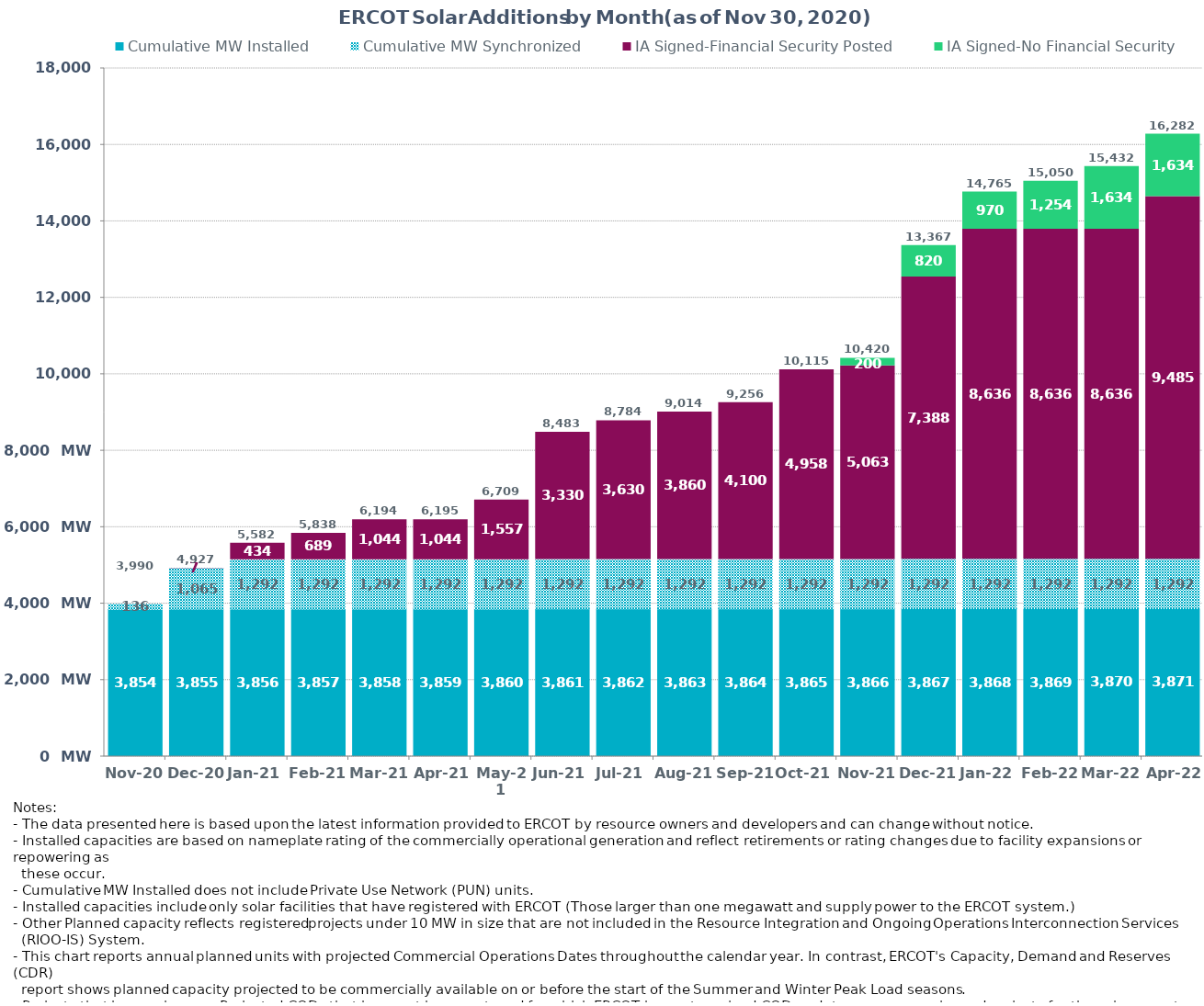
| Category | Cumulative MW Installed | Cumulative MW Synchronized | IA Signed-Financial Security Posted  | IA Signed-No Financial Security  | Other Planned | Cumulative Installed and Planned |
|---|---|---|---|---|---|---|
| 2020-11-20 | 3853.91 | 136.2 | 0 | 0 | 0 | 3990.11 |
| 2020-12-20 | 3854.91 | 1065.15 | 7.4 | 0 | 0 | 4927.46 |
| 2021-01-20 | 3855.91 | 1291.88 | 434.1 | 0 | 0 | 5581.89 |
| 2021-02-20 | 3856.91 | 1291.88 | 689.17 | 0 | 0 | 5837.96 |
| 2021-03-20 | 3857.91 | 1291.88 | 1044.38 | 0 | 0 | 6194.17 |
| 2021-04-20 | 3858.91 | 1291.88 | 1044.38 | 0 | 0 | 6195.17 |
| 2021-05-20 | 3859.91 | 1291.88 | 1557.14 | 0 | 0 | 6708.93 |
| 2021-06-20 | 3860.91 | 1291.88 | 3330.17 | 0 | 0 | 8482.96 |
| 2021-07-20 | 3861.91 | 1291.88 | 3630.17 | 0 | 0 | 8783.96 |
| 2021-08-20 | 3862.91 | 1291.88 | 3859.56 | 0 | 0 | 9014.35 |
| 2021-09-20 | 3863.91 | 1291.88 | 4099.96 | 0 | 0 | 9255.75 |
| 2021-10-20 | 3864.91 | 1291.88 | 4958.04 | 0 | 0 | 10114.83 |
| 2021-11-20 | 3865.91 | 1291.88 | 5062.6 | 200 | 0 | 10420.39 |
| 2021-12-20 | 3866.91 | 1291.88 | 7388.15 | 819.6 | 0 | 13366.54 |
| 2022-01-20 | 3867.91 | 1291.88 | 8635.6 | 969.6 | 0 | 14764.99 |
| 2022-02-20 | 3868.91 | 1291.88 | 8635.6 | 1253.89 | 0 | 15050.28 |
| 2022-03-20 | 3869.91 | 1291.88 | 8635.6 | 1634.3 | 0 | 15431.69 |
| 2022-04-20 | 3870.91 | 1291.88 | 9484.6 | 1634.3 | 0 | 16281.69 |